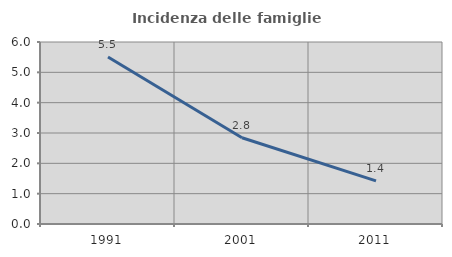
| Category | Incidenza delle famiglie numerose |
|---|---|
| 1991.0 | 5.508 |
| 2001.0 | 2.845 |
| 2011.0 | 1.42 |